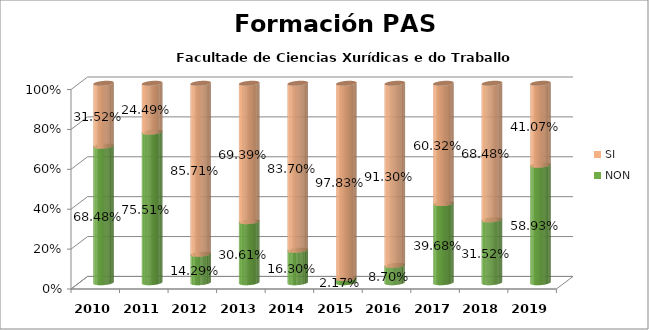
| Category | NON | SI |
|---|---|---|
| 2010.0 | 0.685 | 0.315 |
| 2011.0 | 0.755 | 0.245 |
| 2012.0 | 0.143 | 0.857 |
| 2013.0 | 0.306 | 0.694 |
| 2014.0 | 0.163 | 0.837 |
| 2015.0 | 0.022 | 0.978 |
| 2016.0 | 0.087 | 0.913 |
| 2017.0 | 0.397 | 0.603 |
| 2018.0 | 0.315 | 0.685 |
| 2019.0 | 0.589 | 0.411 |